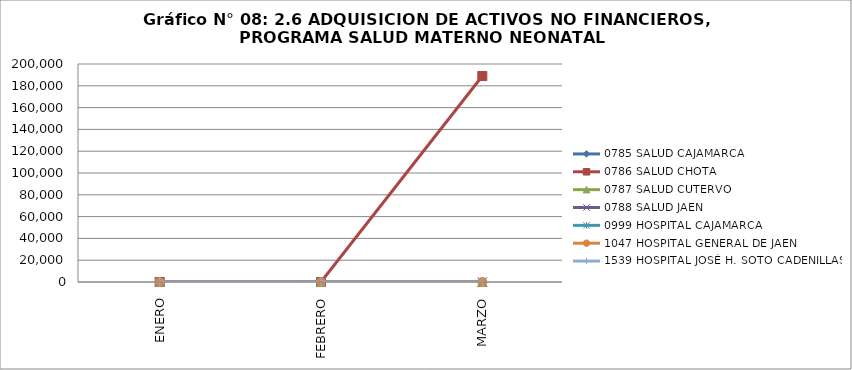
| Category | 0785 SALUD CAJAMARCA | 0786 SALUD CHOTA | 0787 SALUD CUTERVO | 0788 SALUD JAEN | 0999 HOSPITAL CAJAMARCA | 1047 HOSPITAL GENERAL DE JAEN | 1539 HOSPITAL JOSÉ H. SOTO CADENILLAS |
|---|---|---|---|---|---|---|---|
| ENERO | 0 | 0 | 0 | 0 | 0 | 0 | 0 |
| FEBRERO | 0 | 0 | 0 | 0 | 0 | 0 | 0 |
| MARZO | 0 | 189000 | 0 | 0 | 0 | 0 | 0 |